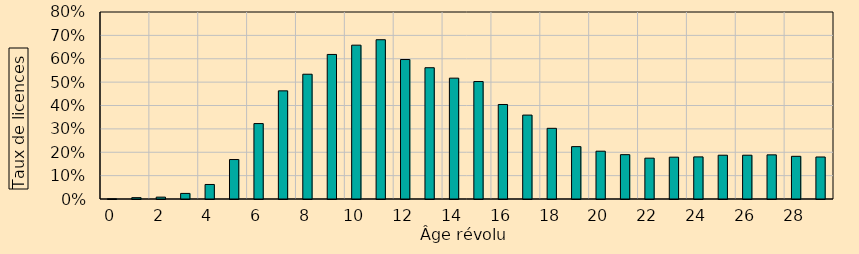
| Category | Series 1 |
|---|---|
| 0.0 | 0.08 |
| 1.0 | 0.57 |
| 2.0 | 0.8 |
| 3.0 | 2.39 |
| 4.0 | 6.21 |
| 5.0 | 16.88 |
| 6.0 | 32.27 |
| 7.0 | 46.27 |
| 8.0 | 53.38 |
| 9.0 | 61.84 |
| 10.0 | 65.81 |
| 11.0 | 68.14 |
| 12.0 | 59.67 |
| 13.0 | 56.16 |
| 14.0 | 51.7 |
| 15.0 | 50.25 |
| 16.0 | 40.43 |
| 17.0 | 35.9 |
| 18.0 | 30.24 |
| 19.0 | 22.4 |
| 20.0 | 20.45 |
| 21.0 | 18.97 |
| 22.0 | 17.47 |
| 23.0 | 17.89 |
| 24.0 | 18.01 |
| 25.0 | 18.73 |
| 26.0 | 18.73 |
| 27.0 | 18.89 |
| 28.0 | 18.26 |
| 29.0 | 17.97 |